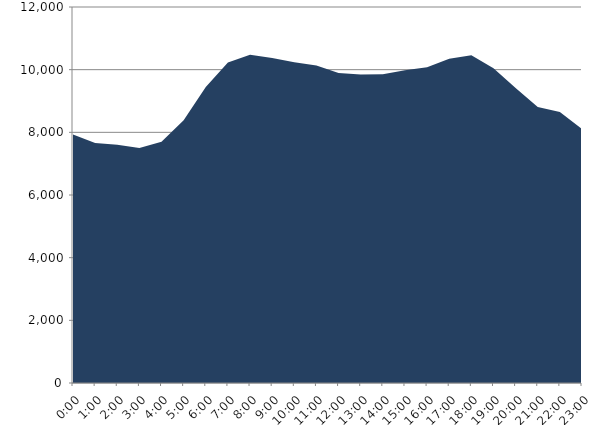
| Category | Series 0 | Series 1 |
|---|---|---|
| 2022-02-16 |  | 7929.16 |
| 2022-02-16 01:00:00 |  | 7657.87 |
| 2022-02-16 02:00:00 |  | 7602.93 |
| 2022-02-16 03:00:00 |  | 7499.8 |
| 2022-02-16 04:00:00 |  | 7703.2 |
| 2022-02-16 05:00:00 |  | 8388.66 |
| 2022-02-16 06:00:00 |  | 9449.24 |
| 2022-02-16 07:00:00 |  | 10232.47 |
| 2022-02-16 08:00:00 |  | 10478.7 |
| 2022-02-16 09:00:00 |  | 10371.07 |
| 2022-02-16 10:00:00 |  | 10234.09 |
| 2022-02-16 11:00:00 |  | 10133.87 |
| 2022-02-16 12:00:00 |  | 9894.57 |
| 2022-02-16 13:00:00 |  | 9843.29 |
| 2022-02-16 14:00:00 |  | 9850.99 |
| 2022-02-16 15:00:00 |  | 9979.63 |
| 2022-02-16 16:00:00 |  | 10074.35 |
| 2022-02-16 17:00:00 |  | 10349 |
| 2022-02-16 18:00:00 |  | 10460.52 |
| 2022-02-16 19:00:00 |  | 10043.38 |
| 2022-02-16 20:00:00 |  | 9416.94 |
| 2022-02-16 21:00:00 |  | 8805.13 |
| 2022-02-16 22:00:00 |  | 8652.86 |
| 2022-02-16 23:00:00 |  | 8102.58 |